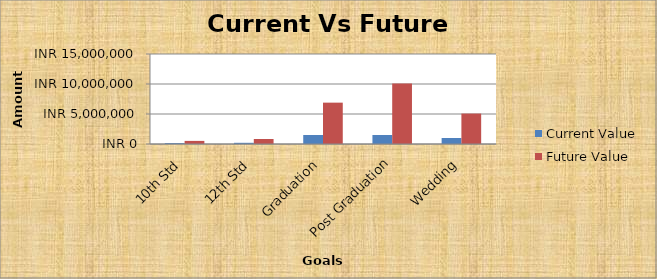
| Category | Current Value | Future Value |
|---|---|---|
| 10th Std | 150000 | 517840.682 |
| 12th Std | 200000 | 835449.634 |
| Graduation | 1500000 | 6892459.48 |
| Post Graduation | 1500000 | 10091249.924 |
| Wedding | 1000000 | 5072366.953 |